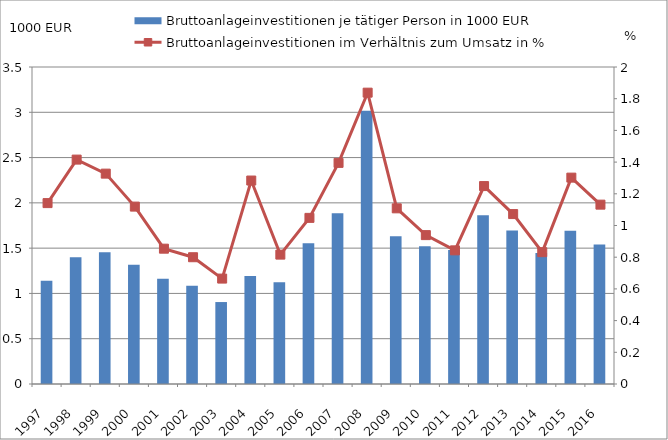
| Category | Bruttoanlageinvestitionen je tätiger Person in 1000 EUR |
|---|---|
| 1997.0 | 1.14 |
| 1998.0 | 1.4 |
| 1999.0 | 1.455 |
| 2000.0 | 1.315 |
| 2001.0 | 1.161 |
| 2002.0 | 1.086 |
| 2003.0 | 0.905 |
| 2004.0 | 1.192 |
| 2005.0 | 1.124 |
| 2006.0 | 1.554 |
| 2007.0 | 1.884 |
| 2008.0 | 3.017 |
| 2009.0 | 1.632 |
| 2010.0 | 1.521 |
| 2011.0 | 1.479 |
| 2012.0 | 1.863 |
| 2013.0 | 1.694 |
| 2014.0 | 1.448 |
| 2015.0 | 1.693 |
| 2016.0 | 1.54 |